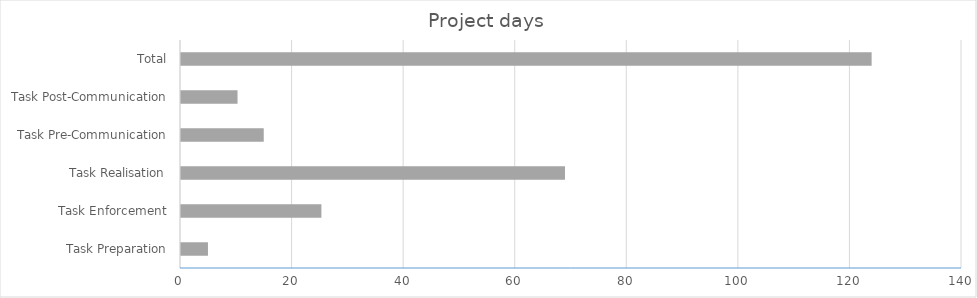
| Category | Series 2 |
|---|---|
| Task Preparation | 4.833 |
| Task Enforcement | 25.167 |
| Task Realisation | 68.833 |
| Task Pre-Communication | 14.833 |
| Task Post-Communication | 10.133 |
| Total | 123.8 |